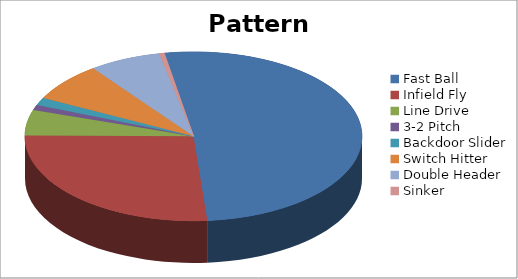
| Category | Pattern Distribution |
|---|---|
| Fast Ball | 105 |
| Infield Fly | 54 |
| Line Drive | 10 |
| 3-2 Pitch | 2 |
| Backdoor Slider | 3 |
| Switch Hitter | 15 |
| Double Header | 14 |
| Sinker | 1 |